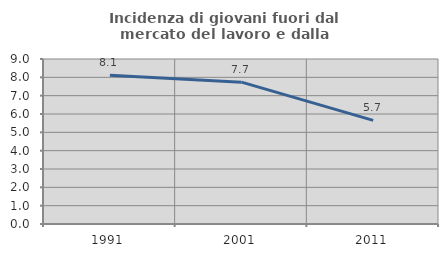
| Category | Incidenza di giovani fuori dal mercato del lavoro e dalla formazione  |
|---|---|
| 1991.0 | 8.112 |
| 2001.0 | 7.736 |
| 2011.0 | 5.654 |